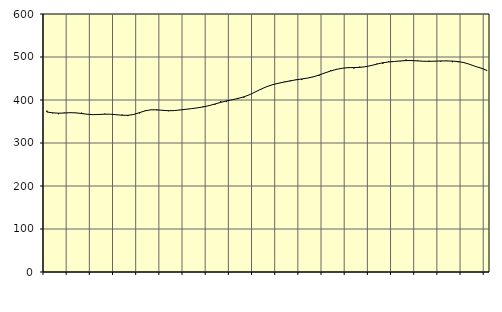
| Category | Piggar | Series 1 |
|---|---|---|
| nan | 375.2 | 372.1 |
| 1.0 | 369 | 370.19 |
| 1.0 | 366.9 | 369.26 |
| 1.0 | 370.7 | 369.73 |
| nan | 370.7 | 370.53 |
| 2.0 | 369.6 | 370.08 |
| 2.0 | 370.7 | 368.57 |
| 2.0 | 366.3 | 366.8 |
| nan | 365.2 | 365.92 |
| 3.0 | 366 | 366.35 |
| 3.0 | 368.2 | 367.04 |
| 3.0 | 367 | 366.92 |
| nan | 365.2 | 365.75 |
| 4.0 | 366.1 | 364.55 |
| 4.0 | 362.6 | 364.4 |
| 4.0 | 366.7 | 366.4 |
| nan | 368.7 | 370.68 |
| 5.0 | 376.3 | 374.91 |
| 5.0 | 376.8 | 377.21 |
| 5.0 | 376 | 377.16 |
| nan | 376.8 | 375.98 |
| 6.0 | 374 | 375.1 |
| 6.0 | 375.2 | 375.39 |
| 6.0 | 377.2 | 376.83 |
| nan | 378.3 | 378.43 |
| 7.0 | 380 | 379.92 |
| 7.0 | 381.5 | 381.76 |
| 7.0 | 385.5 | 383.94 |
| nan | 387.5 | 386.9 |
| 8.0 | 388.7 | 390.66 |
| 8.0 | 397.6 | 394.47 |
| 8.0 | 395.2 | 397.84 |
| nan | 401.1 | 400.61 |
| 9.0 | 404.8 | 403.63 |
| 9.0 | 405.4 | 407.33 |
| 9.0 | 413 | 412.36 |
| nan | 419.4 | 418.83 |
| 10.0 | 425 | 425.55 |
| 10.0 | 432 | 431.32 |
| 10.0 | 436.7 | 435.79 |
| nan | 438.4 | 439.07 |
| 11.0 | 442.8 | 441.8 |
| 11.0 | 443.2 | 444.6 |
| 11.0 | 448 | 446.9 |
| nan | 446.4 | 448.89 |
| 12.0 | 450.7 | 451.03 |
| 12.0 | 454.6 | 453.88 |
| 12.0 | 456.2 | 458.16 |
| nan | 463.4 | 462.97 |
| 13.0 | 469.2 | 467.51 |
| 13.0 | 470.5 | 471.28 |
| 13.0 | 474.1 | 473.86 |
| nan | 476 | 475.19 |
| 14.0 | 472.9 | 475.44 |
| 14.0 | 477.7 | 475.8 |
| 14.0 | 477 | 477.44 |
| nan | 479.3 | 480.17 |
| 15.0 | 484.8 | 483.54 |
| 15.0 | 484.1 | 486.6 |
| 15.0 | 490.1 | 488.42 |
| nan | 489.5 | 489.62 |
| 16.0 | 490.1 | 490.77 |
| 16.0 | 494.1 | 491.71 |
| 16.0 | 492.9 | 491.78 |
| nan | 492.2 | 490.98 |
| 17.0 | 489.7 | 490.13 |
| 17.0 | 491.2 | 489.95 |
| 17.0 | 490.5 | 490.33 |
| nan | 489.2 | 490.81 |
| 18.0 | 491.7 | 490.88 |
| 18.0 | 487.9 | 490.47 |
| 18.0 | 487.8 | 489.33 |
| nan | 487.5 | 486.97 |
| 19.0 | 482.7 | 482.94 |
| 19.0 | 477.4 | 478 |
| 19.0 | 473.1 | 473.99 |
| nan | 469 | 468.56 |